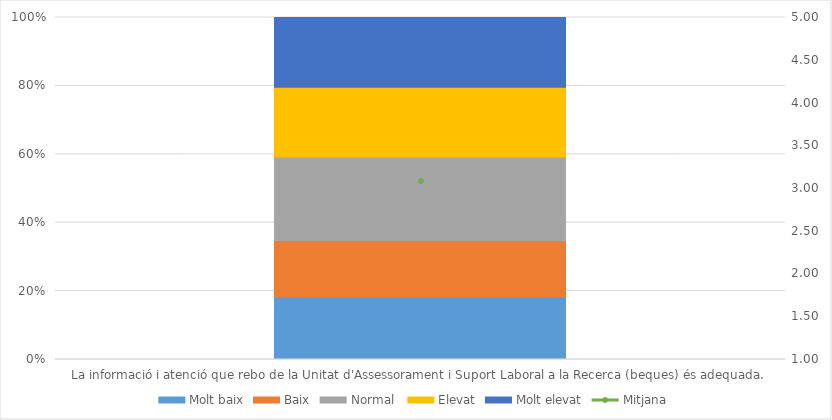
| Category | Molt baix | Baix | Normal  | Elevat | Molt elevat |
|---|---|---|---|---|---|
| La informació i atenció que rebo de la Unitat d'Assessorament i Suport Laboral a la Recerca (beques) és adequada. | 9 | 8 | 12 | 10 | 10 |